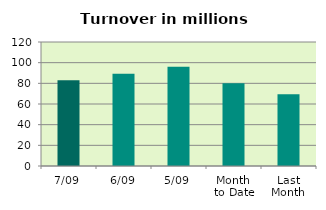
| Category | Series 0 |
|---|---|
| 7/09 | 83.02 |
| 6/09 | 89.32 |
| 5/09 | 96.115 |
| Month 
to Date | 80.147 |
| Last
Month | 69.378 |